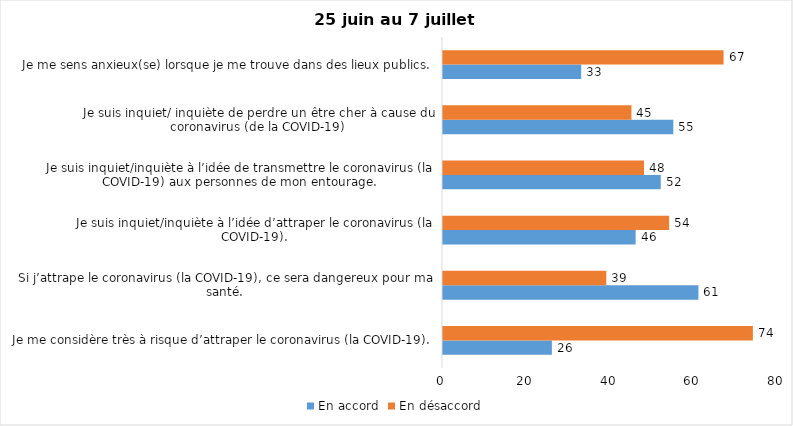
| Category | En accord | En désaccord |
|---|---|---|
| Je me considère très à risque d’attraper le coronavirus (la COVID-19). | 26 | 74 |
| Si j’attrape le coronavirus (la COVID-19), ce sera dangereux pour ma santé. | 61 | 39 |
| Je suis inquiet/inquiète à l’idée d’attraper le coronavirus (la COVID-19). | 46 | 54 |
| Je suis inquiet/inquiète à l’idée de transmettre le coronavirus (la COVID-19) aux personnes de mon entourage. | 52 | 48 |
| Je suis inquiet/ inquiète de perdre un être cher à cause du coronavirus (de la COVID-19) | 55 | 45 |
| Je me sens anxieux(se) lorsque je me trouve dans des lieux publics. | 33 | 67 |